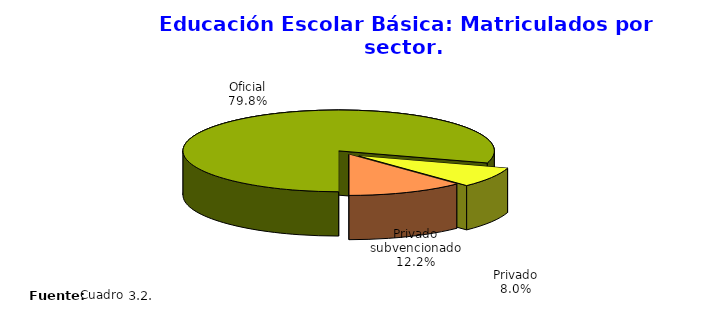
| Category | Series 0 |
|---|---|
| Oficial | 778899 |
| Privado | 78588 |
| Privado subvencionado | 118777 |